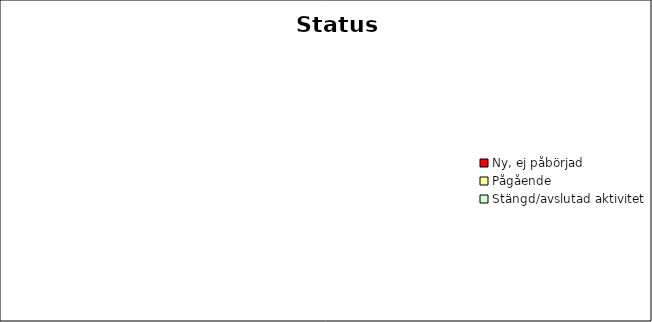
| Category | Series 0 |
|---|---|
| Ny, ej påbörjad | 0 |
| Pågående | 0 |
| Stängd/avslutad aktivitet | 0 |